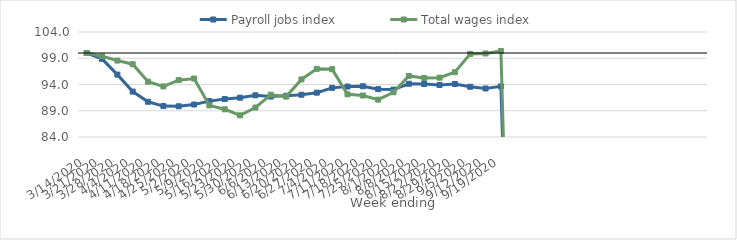
| Category | Payroll jobs index | Total wages index |
|---|---|---|
| 14/03/2020 | 100 | 100 |
| 21/03/2020 | 98.885 | 99.367 |
| 28/03/2020 | 95.882 | 98.562 |
| 04/04/2020 | 92.655 | 97.87 |
| 11/04/2020 | 90.711 | 94.535 |
| 18/04/2020 | 89.888 | 93.641 |
| 25/04/2020 | 89.853 | 94.831 |
| 02/05/2020 | 90.185 | 95.139 |
| 09/05/2020 | 90.834 | 90.023 |
| 16/05/2020 | 91.23 | 89.276 |
| 23/05/2020 | 91.487 | 88.127 |
| 30/05/2020 | 91.938 | 89.611 |
| 06/06/2020 | 91.703 | 92.058 |
| 13/06/2020 | 91.848 | 91.694 |
| 20/06/2020 | 92.048 | 94.968 |
| 27/06/2020 | 92.446 | 96.982 |
| 04/07/2020 | 93.358 | 96.911 |
| 11/07/2020 | 93.61 | 92.129 |
| 18/07/2020 | 93.665 | 91.904 |
| 25/07/2020 | 93.11 | 91.116 |
| 01/08/2020 | 93.031 | 92.524 |
| 08/08/2020 | 94.139 | 95.637 |
| 15/08/2020 | 94.092 | 95.236 |
| 22/08/2020 | 93.899 | 95.301 |
| 29/08/2020 | 94.097 | 96.347 |
| 05/09/2020 | 93.567 | 99.833 |
| 12/09/2020 | 93.24 | 99.916 |
| 19/09/2020 | 93.641 | 100.392 |